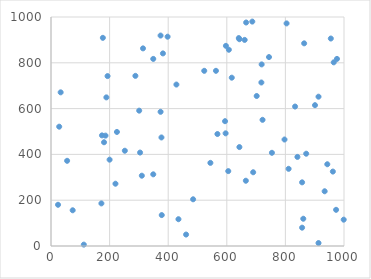
| Category | Series 0 |
|---|---|
| 174.0 | 483 |
| 666.0 | 976 |
| 382.0 | 841 |
| 24.0 | 180 |
| 55.0 | 372 |
| 687.0 | 980 |
| 310.0 | 307 |
| 594.0 | 545 |
| 861.0 | 119 |
| 28.0 | 521 |
| 193.0 | 742 |
| 33.0 | 671 |
| 643.0 | 432 |
| 913.0 | 13 |
| 374.0 | 919 |
| 200.0 | 377 |
| 186.0 | 482 |
| 690.0 | 322 |
| 722.0 | 551 |
| 973.0 | 158 |
| 523.0 | 765 |
| 398.0 | 914 |
| 665.0 | 285 |
| 596.0 | 492 |
| 220.0 | 272 |
| 913.0 | 652 |
| 718.0 | 714 |
| 225.0 | 498 |
| 189.0 | 649 |
| 563.0 | 765 |
| 871.0 | 403 |
| 377.0 | 474 |
| 965.0 | 802 |
| 754.0 | 407 |
| 999.0 | 115 |
| 485.0 | 204 |
| 962.0 | 325 |
| 833.0 | 609 |
| 857.0 | 278 |
| 172.0 | 186 |
| 112.0 | 6 |
| 304.0 | 408 |
| 661.0 | 900 |
| 804.0 | 972 |
| 568.0 | 489 |
| 544.0 | 363 |
| 934.0 | 239 |
| 435.0 | 117 |
| 955.0 | 906 |
| 607.0 | 857 |
| 314.0 | 863 |
| 301.0 | 591 |
| 177.0 | 909 |
| 617.0 | 735 |
| 976.0 | 817 |
| 349.0 | 313 |
| 797.0 | 465 |
| 288.0 | 743 |
| 378.0 | 135 |
| 841.0 | 389 |
| 643.0 | 903 |
| 74.0 | 156 |
| 901.0 | 615 |
| 744.0 | 825 |
| 461.0 | 50 |
| 349.0 | 817 |
| 864.0 | 885 |
| 702.0 | 655 |
| 943.0 | 357 |
| 811.0 | 337 |
| 719.0 | 793 |
| 374.0 | 586 |
| 857.0 | 80 |
| 605.0 | 327 |
| 428.0 | 705 |
| 597.0 | 874 |
| 181.0 | 453 |
| 641.0 | 908 |
| 252.0 | 416 |